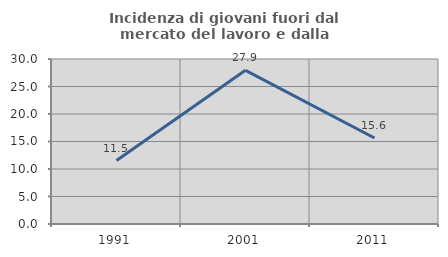
| Category | Incidenza di giovani fuori dal mercato del lavoro e dalla formazione  |
|---|---|
| 1991.0 | 11.538 |
| 2001.0 | 27.941 |
| 2011.0 | 15.642 |